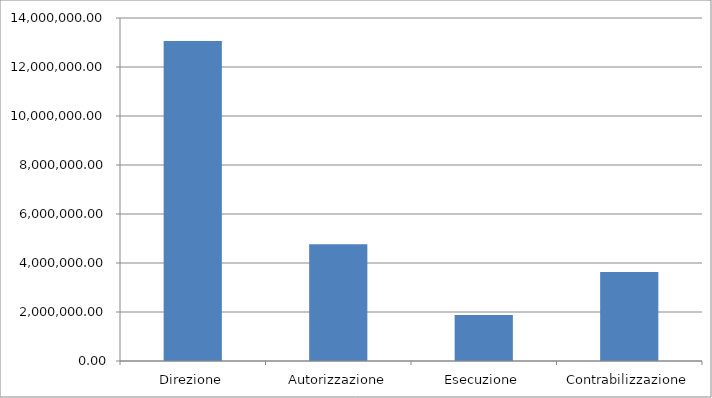
| Category | Series 0 |
|---|---|
| Direzione | 13060702.466 |
| Autorizzazione | 4762593.418 |
| Esecuzione | 1881775.238 |
| Contrabilizzazione | 3631521.868 |